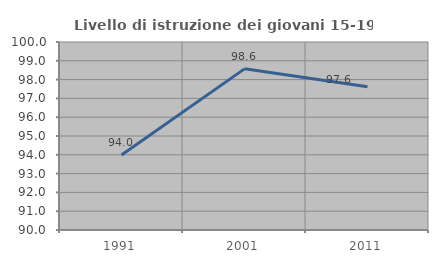
| Category | Livello di istruzione dei giovani 15-19 anni |
|---|---|
| 1991.0 | 93.989 |
| 2001.0 | 98.571 |
| 2011.0 | 97.619 |